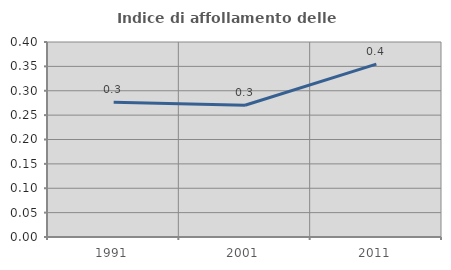
| Category | Indice di affollamento delle abitazioni  |
|---|---|
| 1991.0 | 0.276 |
| 2001.0 | 0.27 |
| 2011.0 | 0.355 |